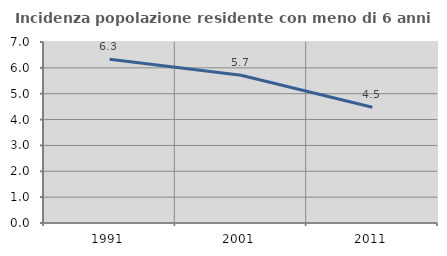
| Category | Incidenza popolazione residente con meno di 6 anni |
|---|---|
| 1991.0 | 6.334 |
| 2001.0 | 5.715 |
| 2011.0 | 4.478 |